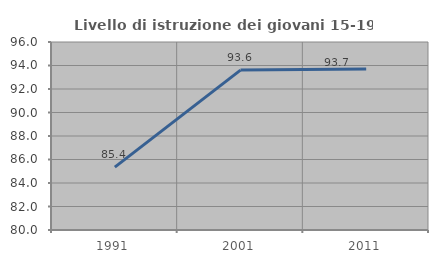
| Category | Livello di istruzione dei giovani 15-19 anni |
|---|---|
| 1991.0 | 85.35 |
| 2001.0 | 93.61 |
| 2011.0 | 93.697 |